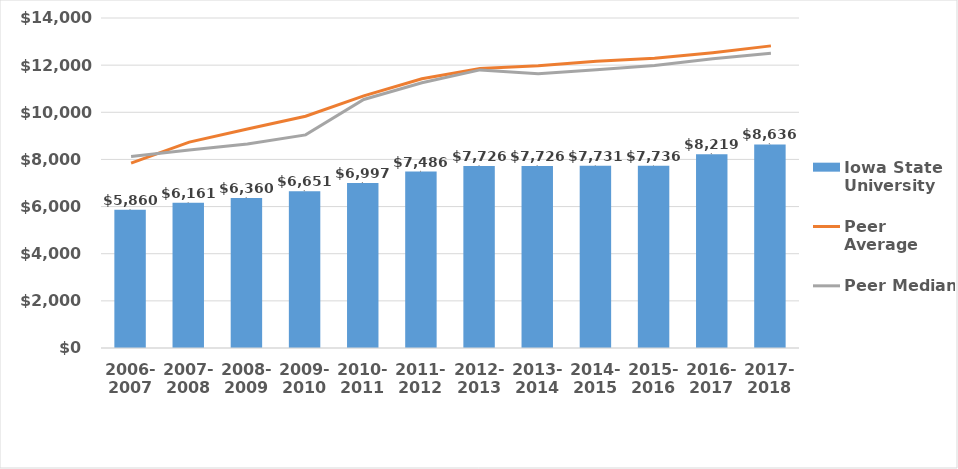
| Category | Iowa State University |
|---|---|
| 2006-
2007 | 5860 |
| 2007-
2008 | 6161.32 |
| 2008-
2009 | 6360 |
| 2009-
2010 | 6651 |
| 2010-
2011 | 6997 |
| 2011-
2012 | 7486 |
| 2012-
2013 | 7726 |
| 2013-
2014 | 7726 |
| 2014-
2015 | 7731.4 |
| 2015-
2016 | 7735.9 |
| 2016-
2017 | 8219.4 |
| 2017-
2018 | 8635.9 |